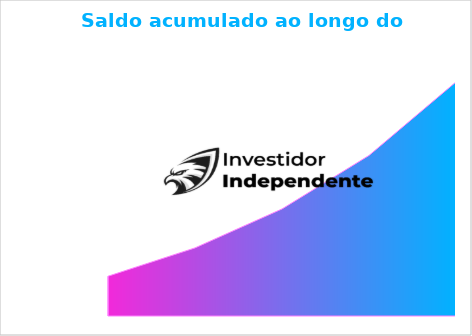
| Category | Saldo acumulado |
|---|---|
| 40.0 | 20774.228 |
| 80.0 | 35577.638 |
| 120.0 | 55917.003 |
| 160.0 | 83862.575 |
| 200.0 | 122258.809 |